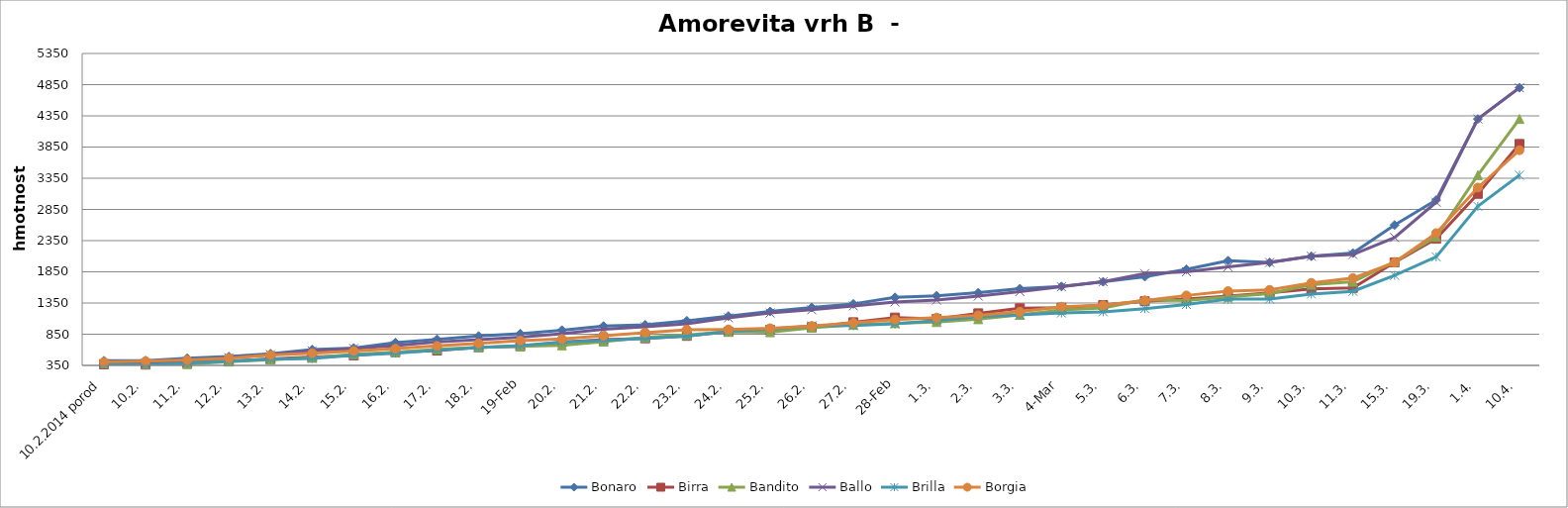
| Category | Bonaro | Birra | Bandito | Ballo | Brilla | Borgia |
|---|---|---|---|---|---|---|
| 10.2.2014 porod | 425 | 366 | 380 | 378 | 375 | 404 |
| 10.2. | 426 | 362 | 372 | 381 | 359 | 418 |
| 11.2. | 466 | 388 | 370 | 410 | 386 | 439 |
| 12.2. | 491 | 418 | 411 | 472 | 416 | 467 |
| 13.2. | 538 | 452 | 443 | 521 | 448 | 516 |
| 14.2. | 604 | 484 | 471 | 584 | 461 | 546 |
| 15.2. | 629 | 510 | 527 | 620 | 511 | 581 |
| 16.2. | 716 | 562 | 561 | 669 | 546 | 618 |
| 17.2. | 768 | 588 | 609 | 725 | 594 | 662 |
| 18.2. | 821 | 641 | 640 | 764 | 634 | 702 |
| 19.2 | 858 | 657 | 656 | 803 | 669 | 747 |
| 20.2. | 915 | 722 | 671 | 859 | 723 | 773 |
| 21.2. | 981 | 764 | 732 | 929 | 750 | 825 |
| 22.2. | 1001 | 784 | 798 | 970 | 783 | 874 |
| 23.2. | 1065 | 823 | 840 | 1017 | 818 | 921 |
| 24.2. | 1141 | 888 | 888 | 1113 | 899 | 926 |
| 25.2. | 1215 | 920 | 881 | 1190 | 930 | 945 |
| 26.2. | 1279 | 963 | 953 | 1242 | 984 | 982 |
| 27.2. | 1336 | 1042 | 999 | 1304 | 988 | 1031 |
| 28.2 | 1441 | 1117 | 1026 | 1366 | 1015 | 1085 |
| 1.3. | 1466 | 1095 | 1044 | 1397 | 1070 | 1116 |
| 2.3. | 1515 | 1185 | 1090 | 1461 | 1130 | 1153 |
| 3.3. | 1580 | 1266 | 1160 | 1533 | 1160 | 1210 |
| 4.3 | 1615 | 1274 | 1240 | 1611 | 1190 | 1290 |
| 5.3. | 1690 | 1318 | 1270 | 1692 | 1209 | 1315 |
| 6.3. | 1772 | 1379 | 1401 | 1822 | 1260 | 1390 |
| 7.3. | 1890 | 1414 | 1390 | 1850 | 1326 | 1471 |
| 8.3. | 2028 | 1460 | 1450 | 1930 | 1412 | 1540 |
| 9.3. | 2000 | 1513 | 1500 | 2000 | 1413 | 1560 |
| 10.3. | 2100 | 1576 | 1642 | 2100 | 1493 | 1672 |
| 11.3. | 2150 | 1592 | 1690 | 2127 | 1537 | 1750 |
| 15.3. | 2600 | 2002 | 2013 | 2400 | 1793 | 2000 |
| 19.3. | 3000 | 2380 | 2410 | 2966 | 2090 | 2470 |
| 1.4. | 4300 | 3100 | 3400 | 4300 | 2900 | 3200 |
| 10.4. | 4800 | 3900 | 4300 | 4800 | 3400 | 3800 |